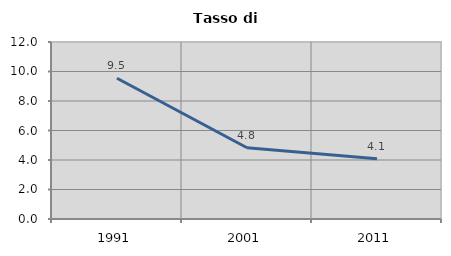
| Category | Tasso di disoccupazione   |
|---|---|
| 1991.0 | 9.545 |
| 2001.0 | 4.828 |
| 2011.0 | 4.082 |